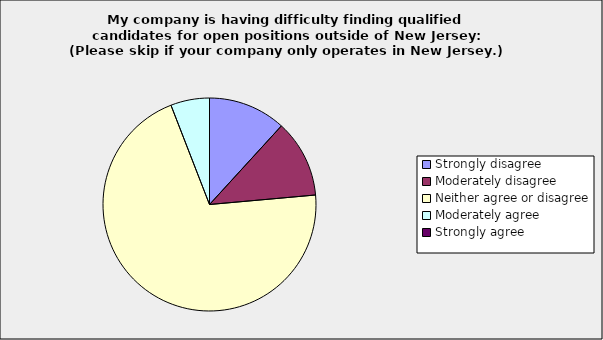
| Category | Series 0 |
|---|---|
| Strongly disagree | 0.118 |
| Moderately disagree | 0.118 |
| Neither agree or disagree | 0.706 |
| Moderately agree | 0.059 |
| Strongly agree | 0 |